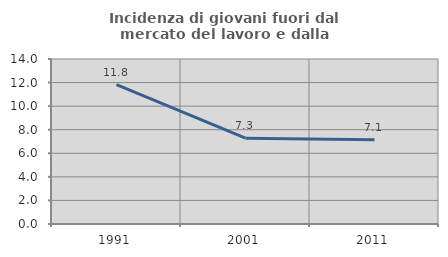
| Category | Incidenza di giovani fuori dal mercato del lavoro e dalla formazione  |
|---|---|
| 1991.0 | 11.82 |
| 2001.0 | 7.278 |
| 2011.0 | 7.143 |